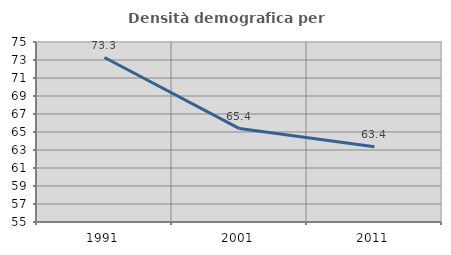
| Category | Densità demografica |
|---|---|
| 1991.0 | 73.276 |
| 2001.0 | 65.378 |
| 2011.0 | 63.352 |